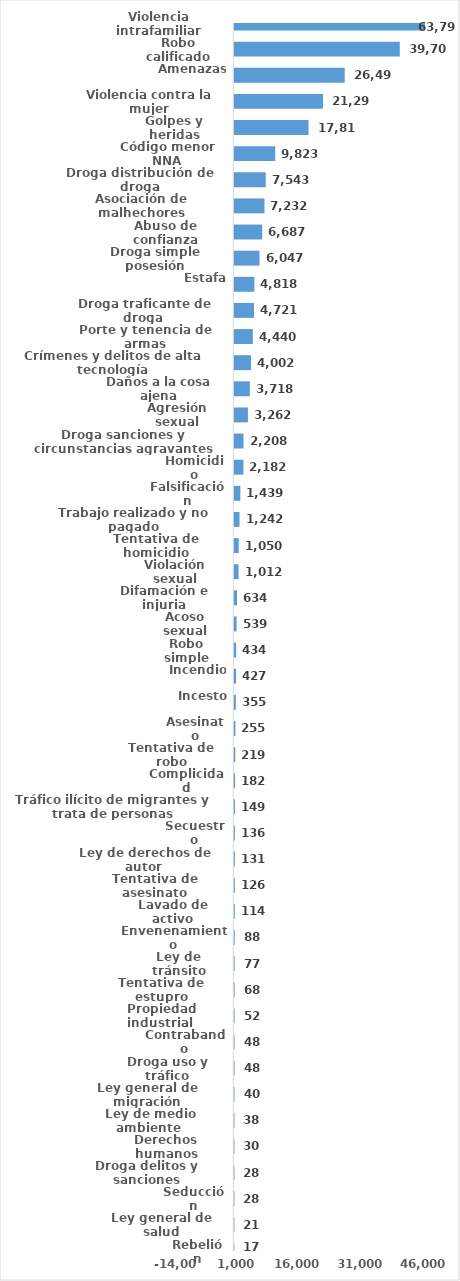
| Category | Series 0 |
|---|---|
| Violencia intrafamiliar | 63792 |
| Robo calificado | 39705 |
| Amenazas | 26494 |
| Violencia contra la mujer | 21293 |
| Golpes y heridas | 17810 |
| Código menor NNA | 9823 |
| Droga distribución de droga | 7543 |
| Asociación de malhechores | 7232 |
| Abuso de confianza | 6687 |
| Droga simple posesión | 6047 |
| Estafa | 4818 |
| Droga traficante de droga  | 4721 |
| Porte y tenencia de armas | 4440 |
| Crímenes y delitos de alta tecnología | 4002 |
| Daños a la cosa ajena | 3718 |
| Agresión sexual | 3262 |
| Droga sanciones y circunstancias agravantes | 2208 |
| Homicidio | 2182 |
| Falsificación | 1439 |
| Trabajo realizado y no pagado | 1242 |
| Tentativa de homicidio | 1050 |
| Violación sexual | 1012 |
| Difamación e injuria | 634 |
| Acoso sexual | 539 |
| Robo simple | 434 |
| Incendio | 427 |
| Incesto | 355 |
| Asesinato | 255 |
| Tentativa de robo | 219 |
| Complicidad | 182 |
| Tráfico ilícito de migrantes y trata de personas | 149 |
| Secuestro | 136 |
| Ley de derechos de autor  | 131 |
| Tentativa de asesinato | 126 |
| Lavado de activo | 114 |
| Envenenamiento | 88 |
| Ley de tránsito | 77 |
| Tentativa de estupro | 68 |
| Propiedad industrial  | 52 |
| Contrabando | 48 |
| Droga uso y tráfico | 48 |
| Ley general de migración | 40 |
| Ley de medio ambiente  | 38 |
| Derechos humanos | 30 |
| Droga delitos y sanciones | 28 |
| Seducción | 28 |
| Ley general de salud | 21 |
| Rebelión | 17 |